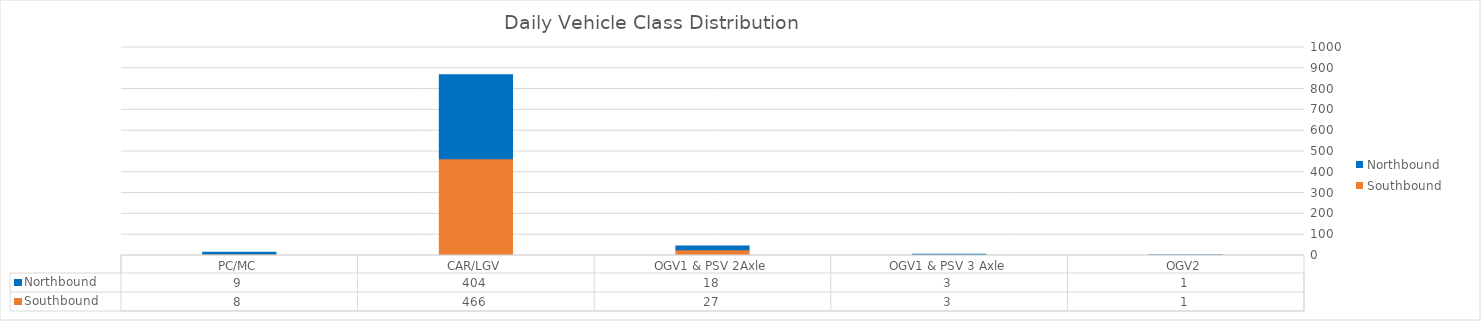
| Category | Southbound | Northbound |
|---|---|---|
| PC/MC | 7.571 | 8.571 |
| CAR/LGV | 465.571 | 403.857 |
| OGV1 & PSV 2Axle | 27.429 | 18.286 |
| OGV1 & PSV 3 Axle | 3.286 | 3 |
| OGV2 | 1.286 | 1 |